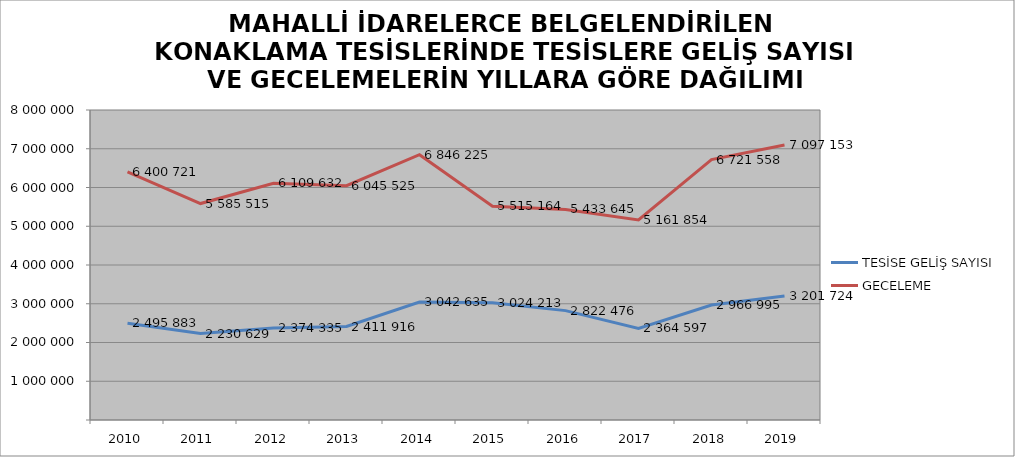
| Category | TESİSE GELİŞ SAYISI | GECELEME |
|---|---|---|
| 2010 | 2495883 | 6400721 |
| 2011 | 2230629 | 5585515 |
| 2012 | 2374335 | 6109632 |
| 2013 | 2411916 | 6045525 |
| 2014 | 3042635 | 6846225 |
| 2015 | 3024213 | 5515164 |
| 2016 | 2822476 | 5433645 |
| 2017 | 2364597 | 5161854 |
| 2018 | 2966995 | 6721558 |
| 2019 | 3201724 | 7097153 |